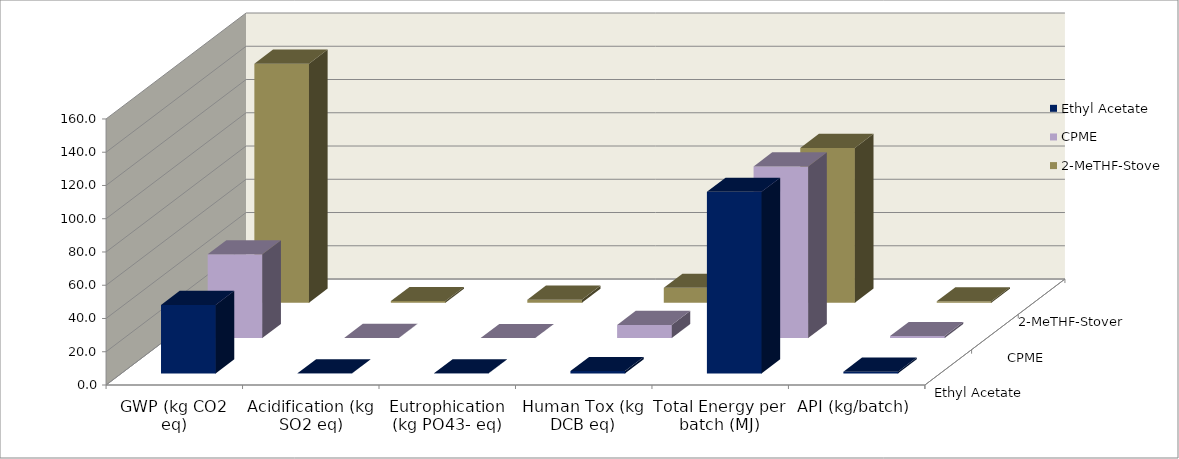
| Category | Ethyl Acetate | CPME | 2-MeTHF-Stover |
|---|---|---|---|
| GWP (kg CO2 eq) | 41.19 | 50.394 | 143.752 |
| Acidification (kg SO2 eq) | 0.049 | 0.087 | 1.027 |
| Eutrophication (kg PO43- eq) | 0.069 | 0.009 | 1.799 |
| Human Tox (kg DCB eq) | 1.373 | 7.9 | 8.984 |
| Total Energy per batch (MJ) | 109.2 | 103.2 | 93.1 |
| API (kg/batch) | 1.03 | 1.19 | 0.89 |